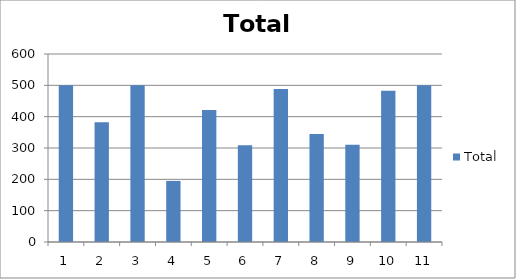
| Category | Total |
|---|---|
| 0 | 500 |
| 1 | 382 |
| 2 | 500 |
| 3 | 195 |
| 4 | 421 |
| 5 | 309 |
| 6 | 488 |
| 7 | 345 |
| 8 | 310 |
| 9 | 483 |
| 10 | 500 |